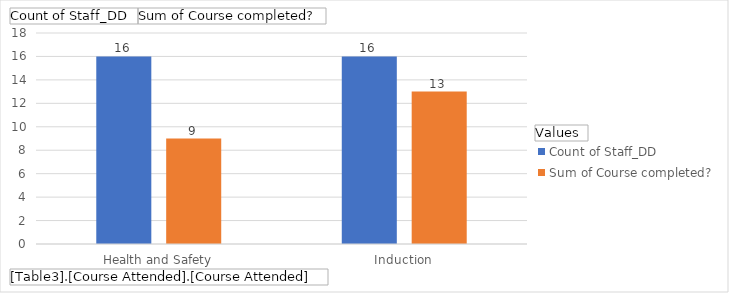
| Category | Count of Staff_DD | Sum of Course completed? |
|---|---|---|
| Health and Safety | 16 | 9 |
| Induction | 16 | 13 |